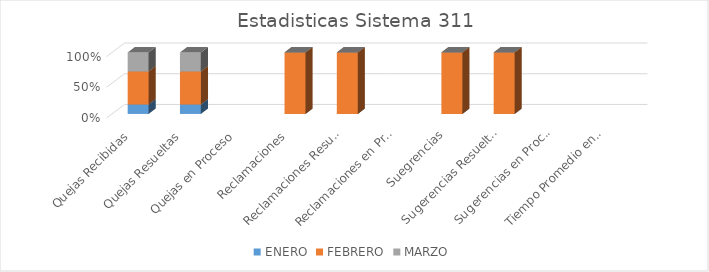
| Category | ENERO | FEBRERO | MARZO |
|---|---|---|---|
| Quejas Recibidas | 2 | 7 | 4 |
| Quejas Resueltas | 2 | 7 | 4 |
| Quejas en Proceso | 0 | 0 | 0 |
| Reclamaciones | 0 | 1 | 0 |
| Reclamaciones Resueltas | 0 | 1 | 0 |
| Reclamaciones en Proceso | 0 | 0 | 0 |
| Suegrencias | 0 | 1 | 0 |
| Sugerencias Resueltas | 0 | 1 | 0 |
| Sugerencias en Proceso | 0 | 0 | 0 |
| Tiempo Promedio en que fueron Respondidas | 0 | 0 | 0 |